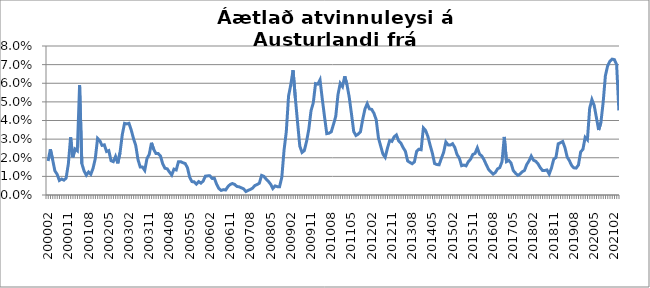
| Category | Series 0 |
|---|---|
| 200002 | 0.018 |
| 200003 | 0.025 |
| 200004 | 0.019 |
| 200005 | 0.013 |
| 200006 | 0.011 |
| 200007 | 0.008 |
| 200008 | 0.009 |
| 200009 | 0.008 |
| 200010 | 0.009 |
| 200011 | 0.017 |
| 200012 | 0.031 |
| 200101 | 0.02 |
| 200102 | 0.025 |
| 200103 | 0.024 |
| 200104 | 0.059 |
| 200105 | 0.017 |
| 200106 | 0.013 |
| 200107 | 0.011 |
| 200108 | 0.012 |
| 200109 | 0.011 |
| 200110 | 0.014 |
| 200111 | 0.02 |
| 200112 | 0.03 |
| 200201 | 0.029 |
| 200202 | 0.027 |
| 200203 | 0.027 |
| 200204 | 0.023 |
| 200205 | 0.024 |
| 200206 | 0.018 |
| 200207 | 0.018 |
| 200208 | 0.021 |
| 200209 | 0.017 |
| 200210 | 0.023 |
| 200211 | 0.032 |
| 200212 | 0.038 |
| 200301 | 0.038 |
| 200302 | 0.038 |
| 200303 | 0.035 |
| 200304 | 0.03 |
| 200305 | 0.027 |
| 200306 | 0.019 |
| 200307 | 0.015 |
| 200308 | 0.015 |
| 200309 | 0.013 |
| 200310 | 0.02 |
| 200311 | 0.022 |
| 200312 | 0.028 |
| 200401 | 0.024 |
| 200402 | 0.022 |
| 200403 | 0.022 |
| 200404 | 0.021 |
| 200405 | 0.017 |
| 200406 | 0.014 |
| 200407 | 0.014 |
| 200408 | 0.012 |
| 200409 | 0.011 |
| 200410 | 0.014 |
| 200411 | 0.013 |
| 200412 | 0.018 |
| 200501 | 0.018 |
| 200502 | 0.017 |
| 200503 | 0.017 |
| 200504 | 0.015 |
| 200505 | 0.009 |
| 200506 | 0.007 |
| 200507 | 0.007 |
| 200508 | 0.006 |
| 200509 | 0.007 |
| 200510 | 0.006 |
| 200511 | 0.007 |
| 200512 | 0.01 |
| 200601 | 0.01 |
| 200602 | 0.01 |
| 200603 | 0.009 |
| 200604 | 0.009 |
| 200605 | 0.006 |
| 200606 | 0.003 |
| 200607 | 0.002 |
| 200608 | 0.003 |
| 200609 | 0.003 |
| 200610 | 0.004 |
| 200611 | 0.006 |
| 200612 | 0.006 |
| 200701 | 0.006 |
| 200702 | 0.005 |
| 200703 | 0.004 |
| 200704 | 0.004 |
| 200705 | 0.003 |
| 200706 | 0.002 |
| 200707 | 0.003 |
| 200708 | 0.003 |
| 200709 | 0.004 |
| 200710 | 0.005 |
| 200711 | 0.006 |
| 200712 | 0.006 |
| 200801 | 0.011 |
| 200802 | 0.01 |
| 200803 | 0.009 |
| 200804 | 0.007 |
| 200805 | 0.006 |
| 200806 | 0.003 |
| 200807 | 0.005 |
| 200808 | 0.004 |
| 200809 | 0.004 |
| 200810 | 0.01 |
| 200811 | 0.024 |
| 200812 | 0.034 |
| 200901 | 0.053 |
| 200902 | 0.059 |
| 200903 | 0.067 |
| 200904 | 0.052 |
| 200905 | 0.039 |
| 200906 | 0.026 |
| 200907 | 0.023 |
| 200908 | 0.024 |
| 200909 | 0.029 |
| 200910 | 0.035 |
| 200911 | 0.045 |
| 200912 | 0.049 |
| 201001 | 0.06 |
| 201002 | 0.06 |
| 201003 | 0.062 |
| 201004 | 0.052 |
| 201005 | 0.042 |
| 201006 | 0.033 |
| 201007 | 0.033 |
| 201008 | 0.034 |
| 201009 | 0.038 |
| 201010 | 0.042 |
| 201011 | 0.054 |
| 201012 | 0.06 |
| 201101 | 0.058 |
| 201102 | 0.064 |
| 201103 | 0.059 |
| 201104 | 0.053 |
| 201105 | 0.044 |
| 201106 | 0.034 |
| 201107 | 0.032 |
| 201108 | 0.033 |
| 201109 | 0.034 |
| 201110 | 0.041 |
| 201111 | 0.046 |
| 201112 | 0.049 |
| 201201 | 0.046 |
| 201202 | 0.046 |
| 201203 | 0.044 |
| 201204 | 0.04 |
| 201205 | 0.031 |
| 201206 | 0.026 |
| 201207 | 0.022 |
| 201208 | 0.02 |
| 201209 | 0.025 |
| 201210 | 0.029 |
| 201211 | 0.029 |
| 201212 | 0.031 |
| 201301 | 0.032 |
| 201302 | 0.029 |
| 201303 | 0.028 |
| 201304 | 0.025 |
| 201305 | 0.023 |
| 201306 | 0.018 |
| 201307 | 0.017 |
| 201308 | 0.017 |
| 201309 | 0.018 |
| 201310 | 0.023 |
| 201311 | 0.025 |
| 201312 | 0.024 |
| 201401 | 0.036 |
| 201402 | 0.035 |
| 201403 | 0.031 |
| 201404 | 0.027 |
| 201405 | 0.022 |
| 201406 | 0.017 |
| 201407 | 0.016 |
| 201408 | 0.016 |
| 201409 | 0.02 |
| 201410 | 0.023 |
| 201411 | 0.028 |
| 201412 | 0.027 |
| 201501 | 0.027 |
| 201502 | 0.028 |
| 201503 | 0.026 |
| 201504 | 0.022 |
| 201505 | 0.02 |
| 201506 | 0.016 |
| 201507 | 0.016 |
| 201508 | 0.016 |
| 201509 | 0.018 |
| 201510 | 0.019 |
| 201511 | 0.022 |
| 201512 | 0.022 |
| 201601 | 0.025 |
| 201602 | 0.022 |
| 201603 | 0.021 |
| 201604 | 0.019 |
| 201605 | 0.016 |
| 201606 | 0.014 |
| 201607 | 0.012 |
| 201608 | 0.011 |
| 201609 | 0.012 |
| 201610 | 0.014 |
| 201611 | 0.015 |
| 201612 | 0.018 |
| 201701 | 0.031 |
| 201702 | 0.018 |
| 201703 | 0.019 |
| 201704 | 0.017 |
| 201705 | 0.013 |
| 201706 | 0.012 |
| 201707 | 0.011 |
| 201708 | 0.011 |
| 201709 | 0.012 |
| 201710 | 0.013 |
| 201711 | 0.016 |
| 201712 | 0.018 |
| 201801 | 0.021 |
| 201802 | 0.019 |
| 201803 | 0.018 |
| 201804 | 0.017 |
| 201805 | 0.015 |
| 201806 | 0.013 |
| 201807 | 0.013 |
| 201808 | 0.013 |
| 201809 | 0.011 |
| 201810 | 0.015 |
| 201811 | 0.019 |
| 201812 | 0.02 |
| 201901 | 0.028 |
| 201902 | 0.028 |
| 201903 | 0.029 |
| 201904 | 0.025 |
| 201905 | 0.02 |
| 201906 | 0.018 |
| 201907 | 0.016 |
| 201908 | 0.015 |
| 201909 | 0.014 |
| 201910 | 0.016 |
| 201911 | 0.023 |
| 201912 | 0.025 |
| 202001 | 0.031 |
| 202002 | 0.03 |
| 202003 | 0.047 |
| 202004 | 0.051 |
| 202005 | 0.048 |
| 202006 | 0.042 |
| 202007 | 0.035 |
| 202008 | 0.039 |
| 202009 | 0.05 |
| 202010 | 0.064 |
| 202011 | 0.069 |
| 202012 | 0.072 |
| 202101 | 0.073 |
| 202102 | 0.073 |
| 202103 | 0.07 |
| 202104*** | 0.045 |